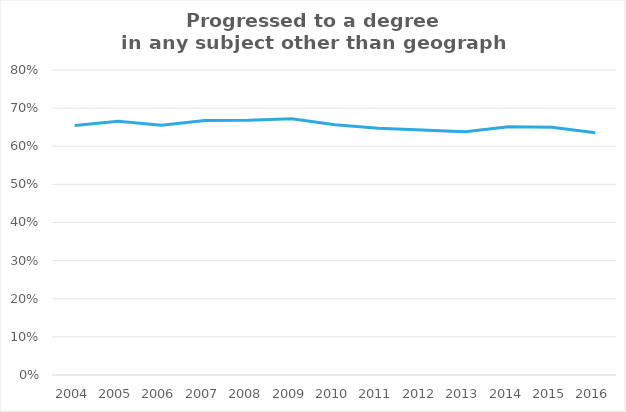
| Category | Other degree subject |
|---|---|
| 2004.0 | 0.655 |
| 2005.0 | 0.665 |
| 2006.0 | 0.655 |
| 2007.0 | 0.668 |
| 2008.0 | 0.668 |
| 2009.0 | 0.672 |
| 2010.0 | 0.656 |
| 2011.0 | 0.647 |
| 2012.0 | 0.643 |
| 2013.0 | 0.638 |
| 2014.0 | 0.651 |
| 2015.0 | 0.65 |
| 2016.0 | 0.635 |